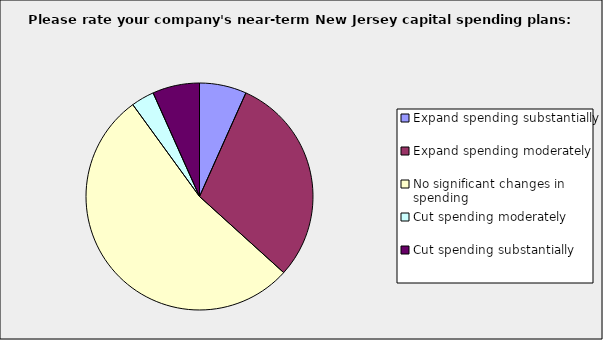
| Category | Series 0 |
|---|---|
| Expand spending substantially | 0.067 |
| Expand spending moderately | 0.3 |
| No significant changes in spending | 0.533 |
| Cut spending moderately | 0.033 |
| Cut spending substantially | 0.067 |